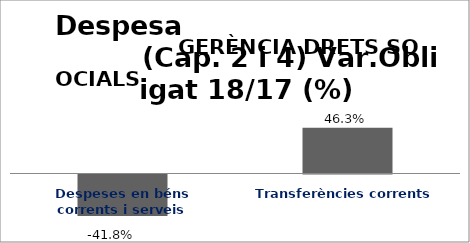
| Category | Series 0 |
|---|---|
| Despeses en béns corrents i serveis | -0.418 |
| Transferències corrents | 0.463 |